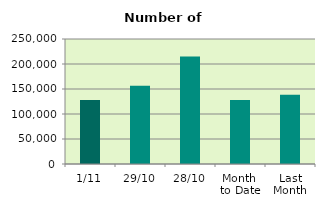
| Category | Series 0 |
|---|---|
| 1/11 | 127864 |
| 29/10 | 156508 |
| 28/10 | 214762 |
| Month 
to Date | 127864 |
| Last
Month | 138693.238 |